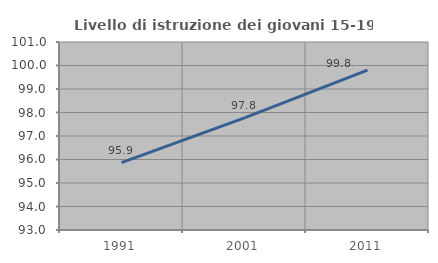
| Category | Livello di istruzione dei giovani 15-19 anni |
|---|---|
| 1991.0 | 95.87 |
| 2001.0 | 97.768 |
| 2011.0 | 99.8 |